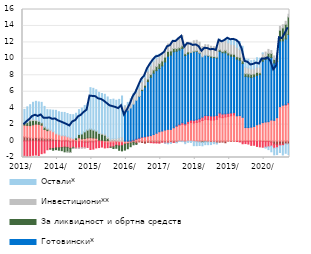
| Category | По трансакционим рачунима | Стамбени | Потрошачки | Готовински* | За ликвидност и обртна средства** | Инвестициони** | Остали* |
|---|---|---|---|---|---|---|---|
| 2013-01-01 | 0.508 | 1.431 | -1.847 | 0 | 0.247 | -0.025 | 1.661 |
| 2013-02-01 | 0.453 | 1.445 | -1.828 | 0 | 0.347 | 0.059 | 1.858 |
| 2013-03-01 | 0.396 | 1.481 | -1.809 | 0 | 0.577 | 0.174 | 1.791 |
| 2013-04-01 | 0.363 | 1.611 | -1.729 | 0 | 0.524 | 0.158 | 2.057 |
| 2013-05-01 | 0.428 | 1.629 | -1.697 | 0 | 0.421 | 0.119 | 2.236 |
| 2013-06-01 | 0.354 | 1.679 | -1.76 | 0 | 0.356 | 0.073 | 2.298 |
| 2013-07-01 | 0.377 | 1.547 | -1.534 | 0 | 0.28 | 0.055 | 2.445 |
| 2013-08-01 | 0.277 | 1.122 | -1.451 | 0 | 0.273 | 0.107 | 2.436 |
| 2013-09-01 | 0.283 | 0.981 | -1.058 | 0 | 0.173 | 0.116 | 2.267 |
| 2013-10-01 | 0.296 | 0.993 | -0.949 | 0 | -0.033 | 0.081 | 2.425 |
| 2013-11-01 | 0.234 | 0.883 | -0.898 | 0 | -0.218 | 0.069 | 2.571 |
| 2013-12-01 | 0.178 | 0.692 | -0.843 | 0 | -0.202 | 0.115 | 2.751 |
| 2014-01-01 | 0.161 | 0.59 | -0.827 | 0 | -0.283 | 0.112 | 2.704 |
| 2014-02-01 | 0.047 | 0.58 | -0.791 | 0 | -0.379 | 0.1 | 2.763 |
| 2014-03-01 | 0.093 | 0.545 | -0.742 | 0 | -0.569 | 0.016 | 2.827 |
| 2014-04-01 | 0.086 | 0.425 | -0.769 | 0 | -0.554 | -0.011 | 2.841 |
| 2014-05-01 | -0.103 | 0.39 | -0.777 | 0 | -0.503 | -0.016 | 2.846 |
| 2014-06-01 | 0.02 | 0.27 | -0.77 | 0 | -0.102 | -0.004 | 2.917 |
| 2014-07-01 | -0.1 | 0.167 | -0.769 | 0 | 0.237 | -0.031 | 2.979 |
| 2014-08-01 | -0.098 | 0.395 | -0.748 | 0 | 0.414 | -0.032 | 3.01 |
| 2014-09-01 | -0.081 | 0.267 | -0.729 | 0 | 0.594 | -0.055 | 3.145 |
| 2014-10-01 | -0.149 | 0.302 | -0.669 | 0 | 0.817 | -0.022 | 3.213 |
| 2014-11-01 | -0.14 | 0.382 | -0.636 | 0 | 0.945 | 0.036 | 3.176 |
| 2014-12-01 | -0.096 | 0.404 | -0.93 | 0 | 1.047 | 0.02 | 5.023 |
| 2015-01-01 | -0.103 | 0.371 | -0.88 | 0 | 0.971 | 0.029 | 5.041 |
| 2015-02-01 | 0.049 | 0.294 | -0.837 | 0 | 0.885 | 0.01 | 4.996 |
| 2015-03-01 | 0.079 | 0.039 | -0.79 | 0 | 0.818 | 0.043 | 4.945 |
| 2015-04-01 | 0.097 | -0.029 | -0.7 | 0 | 0.733 | 0.112 | 4.846 |
| 2015-05-01 | 0.037 | -0.211 | -0.623 | 0 | 0.663 | 0.156 | 4.828 |
| 2015-06-01 | 0.048 | -0.237 | -0.564 | 0 | 0.273 | 0.217 | 4.827 |
| 2015-07-01 | 0.011 | -0.222 | -0.512 | 0 | -0.03 | 0.258 | 4.777 |
| 2015-08-01 | 0.06 | -0.235 | -0.472 | 0 | -0.202 | 0.254 | 4.784 |
| 2015-09-01 | -0.027 | -0.077 | -0.415 | 0 | -0.356 | 0.321 | 4.643 |
| 2015-10-01 | -0.034 | -0.17 | -0.385 | 0 | -0.533 | 0.409 | 4.662 |
| 2015-11-01 | 0.008 | -0.216 | -0.356 | 0 | -0.624 | 0.491 | 4.982 |
| 2015-12-01 | -0.089 | -0.265 | -0.024 | 3.632 | -0.722 | 0.632 | 0.016 |
| 2016-01-01 | -0.127 | -0.175 | -0.021 | 3.762 | -0.611 | 0.682 | 0.257 |
| 2016-02-01 | -0.043 | -0.189 | 0.001 | 4.013 | -0.457 | 0.748 | 0.372 |
| 2016-03-01 | -0.152 | 0.065 | 0.042 | 4.376 | -0.299 | 0.899 | 0.433 |
| 2016-04-01 | -0.291 | 0.194 | 0.05 | 4.714 | -0.12 | 0.918 | 0.433 |
| 2016-05-01 | -0.108 | 0.303 | 0.059 | 5.046 | 0.031 | 0.954 | 0.425 |
| 2016-06-01 | -0.176 | 0.432 | 0.056 | 5.656 | 0.139 | 0.962 | 0.437 |
| 2016-07-01 | -0.255 | 0.503 | 0.03 | 6.024 | 0.239 | 0.947 | 0.404 |
| 2016-08-01 | -0.154 | 0.606 | 0.004 | 6.623 | 0.307 | 0.957 | 0.426 |
| 2016-09-01 | -0.178 | 0.661 | -0.02 | 7.102 | 0.348 | 1.031 | 0.396 |
| 2016-10-01 | -0.176 | 0.793 | -0.055 | 7.461 | 0.394 | 1.006 | 0.414 |
| 2016-11-01 | -0.174 | 0.952 | -0.065 | 7.609 | 0.499 | 0.969 | 0.433 |
| 2016-12-01 | -0.201 | 1.131 | -0.045 | 7.685 | 0.596 | 0.886 | 0.263 |
| 2017-01-01 | -0.106 | 1.22 | -0.024 | 7.92 | 0.595 | 0.87 | 0.053 |
| 2017-02-01 | -0.207 | 1.343 | -0.03 | 8.279 | 0.584 | 0.861 | -0.029 |
| 2017-03-01 | -0.208 | 1.424 | -0.041 | 8.897 | 0.588 | 0.894 | -0.087 |
| 2017-04-01 | -0.152 | 1.419 | -0.038 | 9.037 | 0.509 | 0.925 | -0.101 |
| 2017-05-01 | -0.139 | 1.617 | -0.009 | 9.239 | 0.4 | 0.979 | 0.036 |
| 2017-06-01 | -0.149 | 1.807 | 0.026 | 9.09 | 0.33 | 1.082 | -0.071 |
| 2017-07-01 | -0.013 | 1.938 | 0.095 | 9.039 | 0.286 | 1.153 | -0.047 |
| 2017-08-01 | -0.026 | 2.037 | 0.187 | 9.028 | 0.319 | 1.239 | -0.048 |
| 2017-09-01 | -0.096 | 1.953 | 0.144 | 8.311 | 0.208 | 1.123 | -0.228 |
| 2017-10-01 | -0.014 | 2.157 | 0.238 | 8.209 | 0.241 | 1.163 | -0.142 |
| 2017-11-01 | -0.023 | 2.254 | 0.303 | 8.195 | 0.045 | 1.16 | -0.142 |
| 2017-12-01 | -0.056 | 2.205 | 0.311 | 8.33 | 0.09 | 1.26 | -0.508 |
| 2018-01-01 | -0.081 | 2.265 | 0.327 | 8.3 | 0.083 | 1.278 | -0.481 |
| 2018-02-01 | -0.113 | 2.34 | 0.369 | 7.965 | 0.047 | 1.301 | -0.424 |
| 2018-03-01 | -0.111 | 2.495 | 0.416 | 7.335 | -0.033 | 1.25 | -0.433 |
| 2018-04-01 | -0.081 | 2.649 | 0.463 | 7.33 | -0.002 | 1.282 | -0.359 |
| 2018-05-01 | -0.115 | 2.601 | 0.491 | 7.248 | 0.078 | 1.279 | -0.329 |
| 2018-06-01 | -0.166 | 2.547 | 0.505 | 7.138 | 0.143 | 1.197 | -0.261 |
| 2018-07-01 | -0.145 | 2.554 | 0.495 | 7.101 | 0.124 | 1.2 | -0.178 |
| 2018-08-01 | -0.225 | 2.647 | 0.474 | 6.992 | 0.092 | 1.178 | -0.137 |
| 2018-09-01 | -0.14 | 2.915 | 0.498 | 7.489 | 0.205 | 1.226 | 0.07 |
| 2018-10-01 | -0.125 | 2.846 | 0.442 | 7.456 | 0.158 | 1.193 | 0.104 |
| 2018-11-01 | -0.206 | 2.929 | 0.385 | 7.416 | 0.306 | 1.244 | 0.165 |
| 2018-12-01 | -0.005 | 3.009 | 0.366 | 7.096 | 0.257 | 1.224 | 0.559 |
| 2019-01-01 | -0.045 | 3.078 | 0.343 | 6.898 | 0.267 | 1.186 | 0.594 |
| 2019-02-01 | -0.024 | 3.175 | 0.284 | 6.823 | 0.273 | 1.178 | 0.658 |
| 2019-03-01 | -0.041 | 3.067 | -0.017 | 6.909 | 0.281 | 1.148 | 0.909 |
| 2019-04-01 | -0.041 | 3.102 | -0.071 | 6.728 | 0.35 | 0.959 | 0.944 |
| 2019-05-01 | -0.101 | 2.892 | -0.229 | 6.532 | 0.332 | 0.851 | 0.917 |
| 2019-06-01 | -0.032 | 1.641 | -0.277 | 6.225 | 0.324 | 0.815 | 0.995 |
| 2019-07-01 | -0.025 | 1.64 | -0.34 | 6.167 | 0.367 | 0.718 | 1.061 |
| 2019-08-01 | -0.025 | 1.693 | -0.499 | 6.043 | 0.38 | 0.64 | 1.02 |
| 2019-09-01 | 0.002 | 1.775 | -0.51 | 6.049 | 0.332 | 0.612 | 1.07 |
| 2019-10-01 | -0.05 | 1.982 | -0.601 | 6.001 | 0.376 | 0.64 | 1.136 |
| 2019-11-01 | 0.007 | 2.063 | -0.707 | 6.01 | 0.22 | 0.687 | 1.091 |
| 2019-12-01 | -0.045 | 2.247 | -0.705 | 7.459 | 0.31 | 0.604 | 0.11 |
| 2020-01-31 | -0.067 | 2.32 | -0.682 | 7.598 | 0.358 | 0.543 | -0.106 |
| 2020-02-29 | -0.05 | 2.357 | -0.646 | 7.878 | 0.431 | 0.481 | -0.343 |
| 2020-03-31 | -0.142 | 2.559 | -0.469 | 7.592 | 0.497 | 0.362 | -0.692 |
| 2020-04-30 | -0.391 | 2.519 | -0.482 | 6.976 | 0.428 | 0.428 | -0.806 |
| 2020-05-31 | -0.497 | 2.845 | -0.315 | 6.823 | 0.636 | 0.451 | -0.835 |
| 2020-06-30 | -0.368 | 4.188 | -0.212 | 7.993 | 1.298 | 0.472 | -0.813 |
| 2020-07-31 | -0.412 | 4.363 | -0.136 | 7.827 | 1.569 | 0.389 | -1.143 |
| 2020-08-31 | -0.35 | 4.374 | 0.053 | 7.995 | 1.779 | 0.365 | -1.138 |
| 2020-09-30 | -0.363 | 4.491 | 0.175 | 8.283 | 2.132 | 0.326 | -1.274 |